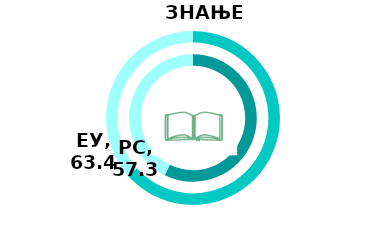
| Category | РС | Series 1 | ЕУ |
|---|---|---|---|
| Index | 57.3 |  | 63.4 |
| Rest | 42.7 |  | 36.6 |